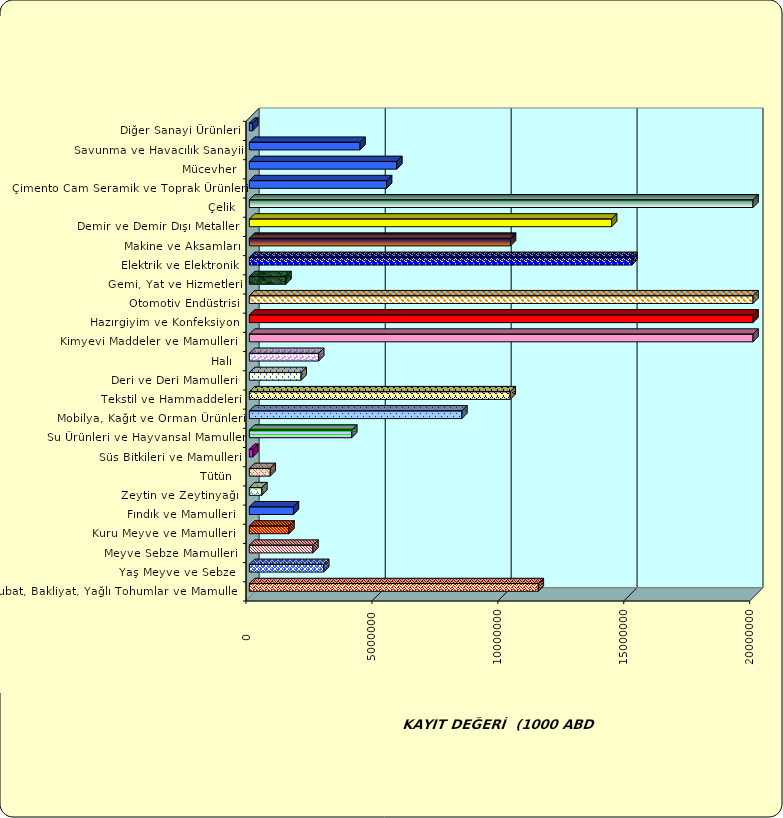
| Category | Series 0 |
|---|---|
|  Hububat, Bakliyat, Yağlı Tohumlar ve Mamulleri  | 11473747.928 |
|  Yaş Meyve ve Sebze   | 2953661.686 |
|  Meyve Sebze Mamulleri  | 2525538.9 |
|  Kuru Meyve ve Mamulleri   | 1573463.696 |
|  Fındık ve Mamulleri  | 1751055.183 |
|  Zeytin ve Zeytinyağı  | 495838.061 |
|  Tütün  | 829173.772 |
|  Süs Bitkileri ve Mamulleri | 137200.536 |
|  Su Ürünleri ve Hayvansal Mamuller | 4066045.855 |
|  Mobilya, Kağıt ve Orman Ürünleri | 8440766.375 |
|  Tekstil ve Hammaddeleri | 10358778.494 |
|  Deri ve Deri Mamulleri  | 2057757.266 |
|  Halı  | 2754756.872 |
|  Kimyevi Maddeler ve Mamulleri   | 33524626.388 |
|  Hazırgiyim ve Konfeksiyon  | 21205484.3 |
|  Otomotiv Endüstrisi | 30995808.344 |
|  Gemi, Yat ve Hizmetleri | 1453284.152 |
|  Elektrik ve Elektronik | 15193324.298 |
|  Makine ve Aksamları | 10371714.083 |
|  Demir ve Demir Dışı Metaller  | 14385432.834 |
|  Çelik | 21062568.489 |
|  Çimento Cam Seramik ve Toprak Ürünleri | 5449213.877 |
|  Mücevher | 5855832.008 |
|  Savunma ve Havacılık Sanayii | 4395997.079 |
|  Diğer Sanayi Ürünleri | 135663.675 |